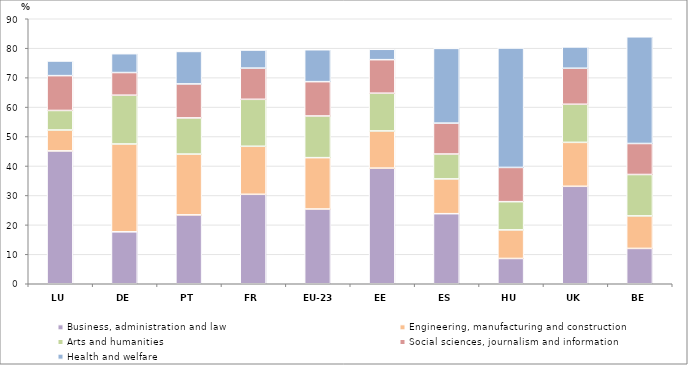
| Category | Business, administration and law | Engineering, manufacturing and construction | Arts and humanities | Social sciences, journalism and information | Health and welfare |
|---|---|---|---|---|---|
| LU | 45.118 | 7.095 | 6.64 | 11.825 | 4.973 |
| DE | 17.638 | 29.827 | 16.579 | 7.691 | 6.402 |
| PT | 23.391 | 20.647 | 12.293 | 11.536 | 11.026 |
| FR | 30.377 | 16.315 | 15.952 | 10.588 | 6.144 |
| EU-23 | 25.388 | 17.439 | 14.154 | 11.657 | 10.841 |
| EE | 39.265 | 12.637 | 12.816 | 11.386 | 3.523 |
| ES | 23.796 | 11.809 | 8.451 | 10.498 | 25.382 |
| HU | 8.59 | 9.698 | 9.591 | 11.627 | 40.564 |
| UK | 33.101 | 14.921 | 12.938 | 12.234 | 7.232 |
| BE | 12.001 | 11.037 | 14.071 | 10.528 | 36.229 |